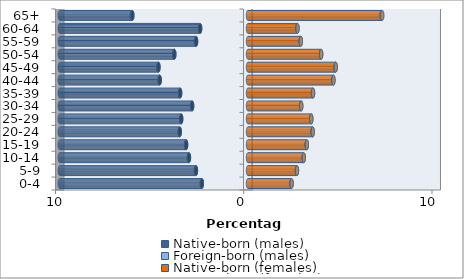
| Category | Native-born (males) | Foreign-born (males) | Native-born (females) | Foreign-born (females) |
|---|---|---|---|---|
| 0-4 | -2.453 | -0.001 | 2.314 | 0.001 |
| 5-9 | -2.765 | -0.001 | 2.6 | 0.001 |
| 10-14 | -3.137 | -0.002 | 2.959 | 0.001 |
| 15-19 | -3.287 | -0.002 | 3.122 | 0.002 |
| 20-24 | -3.625 | -0.002 | 3.434 | 0.003 |
| 25-29 | -3.548 | -0.003 | 3.36 | 0.003 |
| 30-34 | -2.969 | -0.003 | 2.824 | 0.003 |
| 35-39 | -3.605 | -0.003 | 3.452 | 0.004 |
| 40-44 | -4.69 | -0.002 | 4.534 | 0.004 |
| 45-49 | -4.758 | -0.003 | 4.655 | 0.005 |
| 50-54 | -3.915 | -0.003 | 3.882 | 0.005 |
| 55-59 | -2.758 | -0.003 | 2.802 | 0.005 |
| 60-64 | -2.543 | -0.004 | 2.625 | 0.005 |
| 65+ | -6.146 | -0.033 | 7.097 | 0.037 |